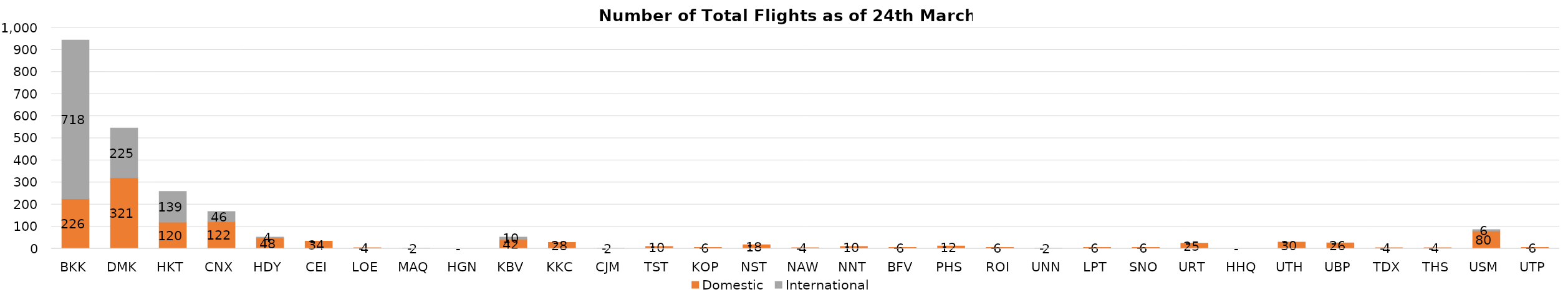
| Category | Domestic | International |
|---|---|---|
| BKK | 226 | 718 |
| DMK | 321 | 225 |
| HKT | 120 | 139 |
| CNX | 122 | 46 |
| HDY | 48 | 4 |
| CEI | 34 | 0 |
| LOE | 4 | 0 |
| MAQ | 2 | 0 |
| HGN | 0 | 0 |
| KBV | 42 | 10 |
| KKC | 28 | 0 |
| CJM | 2 | 0 |
| TST | 10 | 0 |
| KOP | 6 | 0 |
| NST | 18 | 0 |
| NAW | 4 | 0 |
| NNT | 10 | 0 |
| BFV | 6 | 0 |
| PHS | 12 | 0 |
| ROI | 6 | 0 |
| UNN | 2 | 0 |
| LPT | 6 | 0 |
| SNO | 6 | 0 |
| URT | 25 | 0 |
| HHQ | 0 | 0 |
| UTH | 30 | 0 |
| UBP | 26 | 0 |
| TDX | 4 | 0 |
| THS | 4 | 0 |
| USM | 80 | 6 |
| UTP | 6 | 0 |